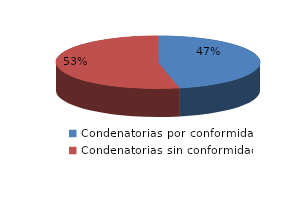
| Category | Series 0 |
|---|---|
| 0 | 90 |
| 1 | 103 |